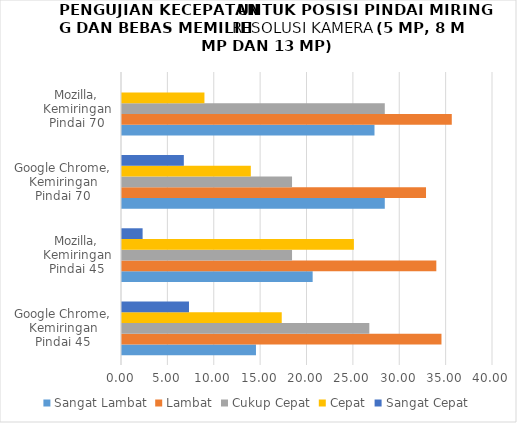
| Category | Sangat Lambat | Lambat | Cukup Cepat | Cepat | Sangat Cepat |
|---|---|---|---|---|---|
| Google Chrome, Kemiringan Pindai 45 | 14.444 | 34.444 | 26.667 | 17.222 | 7.222 |
| Mozilla, Kemiringan Pindai 45 | 20.556 | 33.889 | 18.333 | 25 | 2.222 |
| Google Chrome, Kemiringan Pindai 70 | 28.333 | 32.778 | 18.333 | 13.889 | 6.667 |
| Mozilla, Kemiringan Pindai 70 | 27.222 | 35.556 | 28.333 | 8.889 | 0 |